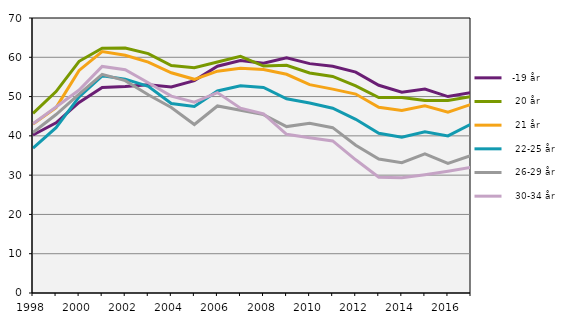
| Category |   -19 år |    20 år |    21 år |    22-25 år |    26-29 år |    30-34 år |
|---|---|---|---|---|---|---|
| 1998.0 | 40.208 | 45.734 | 43.015 | 36.896 | 40.857 | 43.093 |
| 1999.0 | 43.307 | 51.267 | 47.18 | 42.065 | 45.423 | 47.342 |
| 2000.0 | 48.507 | 58.983 | 56.657 | 49.91 | 50.641 | 51.655 |
| 2001.0 | 52.295 | 62.298 | 61.481 | 55.283 | 55.663 | 57.68 |
| 2002.0 | 52.559 | 62.34 | 60.52 | 54.448 | 54.054 | 56.813 |
| 2003.0 | 53.02 | 60.937 | 58.765 | 52.587 | 50.462 | 53.527 |
| 2004.0 | 52.446 | 57.901 | 56.06 | 48.228 | 47.237 | 50.118 |
| 2005.0 | 54.062 | 57.334 | 54.393 | 47.495 | 42.89 | 48.59 |
| 2006.0 | 57.721 | 58.812 | 56.462 | 51.44 | 47.609 | 51.016 |
| 2007.0 | 59.196 | 60.245 | 57.199 | 52.731 | 46.509 | 47.044 |
| 2008.0 | 58.496 | 57.773 | 56.88 | 52.313 | 45.421 | 45.602 |
| 2009.0 | 59.887 | 57.984 | 55.674 | 49.445 | 42.362 | 40.384 |
| 2010.0 | 58.383 | 56.021 | 53.032 | 48.381 | 43.207 | 39.528 |
| 2011.0 | 57.694 | 55.128 | 51.9 | 47.033 | 42.089 | 38.705 |
| 2012.0 | 56.218 | 52.723 | 50.64 | 44.206 | 37.622 | 33.905 |
| 2013.0 | 52.879 | 49.75 | 47.273 | 40.667 | 34.088 | 29.452 |
| 2014.0 | 51.093 | 49.762 | 46.437 | 39.644 | 33.163 | 29.32 |
| 2015.0 | 51.921 | 49.002 | 47.645 | 41.055 | 35.422 | 30.105 |
| 2016.0 | 50 | 49 | 46 | 40 | 33 | 31 |
| 2017.0 | 51 | 50 | 48 | 43 | 35 | 32 |